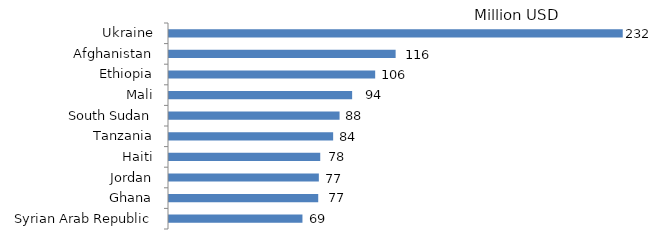
| Category | Series 0 |
|---|---|
| Ukraine | 232.007 |
| Afghanistan | 116.136 |
| Ethiopia | 105.706 |
| Mali | 93.946 |
| South Sudan | 87.532 |
| Tanzania | 84.259 |
| Haiti | 77.676 |
| Jordan | 76.962 |
| Ghana | 76.645 |
| Syrian Arab Republic | 68.598 |